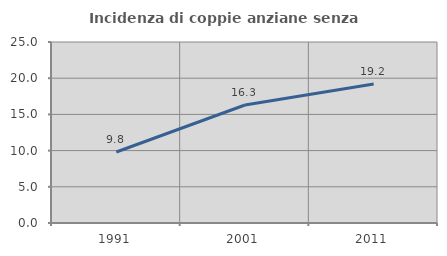
| Category | Incidenza di coppie anziane senza figli  |
|---|---|
| 1991.0 | 9.808 |
| 2001.0 | 16.296 |
| 2011.0 | 19.203 |